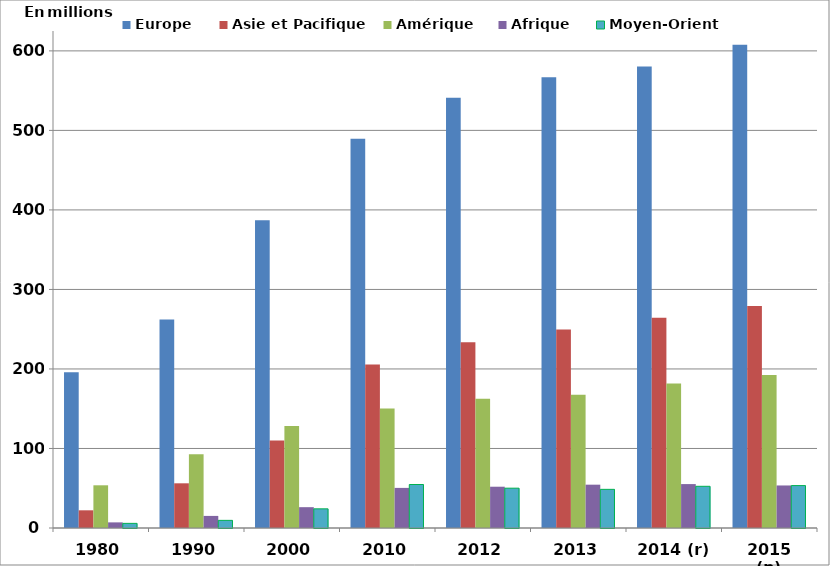
| Category | Europe | Asie et Pacifique | Amérique | Afrique | Moyen-Orient |
|---|---|---|---|---|---|
| 1980 | 196 | 22.247 | 53.703 | 7.07 | 5.821 |
| 1990 | 262.3 | 56.2 | 92.8 | 15.2 | 9.6 |
| 2000 | 387.1 | 110.134 | 128.189 | 26.196 | 24.09 |
| 2010 | 489.359 | 205.505 | 150.195 | 50.426 | 54.699 |
| 2012 | 540.933 | 233.628 | 162.521 | 51.919 | 50.067 |
| 2013 | 566.87 | 249.722 | 167.513 | 54.477 | 48.606 |
| 2014 (r) | 580.238 | 264.38 | 181.851 | 55.225 | 52.44 |
| 2015 (p) | 607.579 | 279.221 | 192.559 | 53.489 | 53.33 |